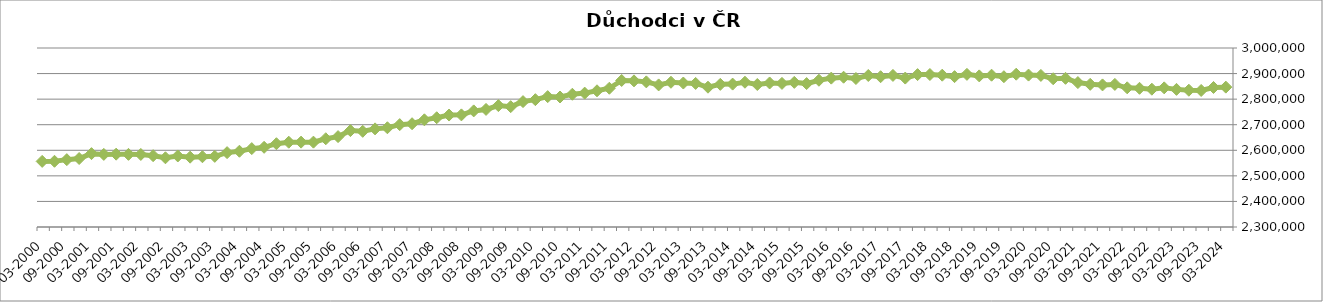
| Category | Důchodci celkem |
|---|---|
| 03-2024 | 2846965 |
| 12-2023 | 2845583 |
| 09-2023 | 2833931 |
| 06-2023 | 2834958 |
| 03-2023 | 2838175 |
| 12-2022 | 2844180 |
| 09-2022 | 2838955 |
| 06-2022 | 2842456 |
| 03-2022 | 2844309 |
| 12-2021 | 2857644 |
| 09-2021 | 2855669 |
| 06-2021 | 2857971 |
| 03-2021 | 2864719 |
| 12-2020 | 2881424 |
| 09-2020 | 2879686 |
| 06-2020 | 2892823 |
| 03-2020 | 2894058 |
| 12-2019 | 2897527 |
| 09-2019 | 2887695 |
| 06-2019 | 2893634 |
| 03-2019 | 2890927 |
| 12-2018 | 2896973 |
| 09-2018 | 2888033 |
| 06-2018 | 2893665 |
| 03-2018 | 2896292 |
| 12-2017 | 2895963 |
| 09-2017 | 2882415 |
| 06-2017 | 2892765 |
| 03-2017 | 2887731 |
| 12-2016 | 2892469 |
| 09-2016 | 2880677 |
| 06-2016 | 2885753 |
| 03-2016 | 2882164 |
| 12-2015 | 2873953 |
| 09-2015 | 2860813 |
| 06-2015 | 2865566 |
| 03-2015 | 2861611 |
| 12-2014 | 2863210 |
| 09-2014 | 2857229 |
| 06-2014 | 2866146 |
| 03-2014 | 2858820 |
| 12-2013 | 2857856 |
| 09-2013 | 2846736 |
| 06-2013 | 2861513 |
| 03-2013 | 2863034 |
| 12-2012 | 2866056 |
| 09-2012 | 2855623 |
| 06-2012 | 2867553 |
| 03-2012 | 2871453 |
| 12-2011 | 2873004 |
| 09-2011 | 2842624 |
| 06-2011 | 2832699 |
| 03-2011 | 2823583 |
| 12-2010 | 2819093 |
| 09-2010 | 2808379 |
| 06-2010 | 2809816 |
| 03-2010 | 2797939 |
| 12-2009 | 2790391 |
| 09-2009 | 2770585 |
| 06-2009 | 2774751 |
| 03-2009 | 2759803 |
| 12-2008 | 2754011 |
| 09-2008 | 2738474 |
| 06-2008 | 2737848 |
| 03-2008 | 2727240 |
| 12-2007 | 2719161 |
| 09-2007 | 2703847 |
| 06-2007 | 2700296 |
| 03-2007 | 2688078 |
| 12-2006 | 2683784 |
| 09-2006 | 2674191 |
| 06-2006 | 2676952 |
| 03-2006 | 2653503 |
| 12-2005 | 2645100 |
| 09-2005 | 2631838 |
| 06-2005 | 2631911 |
| 03-2005 | 2631601 |
| 12-2004 | 2625685 |
| 09-2004 | 2611669 |
| 06-2004 | 2606596 |
| 03-2004 | 2596243 |
| 12-2003 | 2590844 |
| 09-2003 | 2576302 |
| 06-2003 | 2574725 |
| 03-2003 | 2573082 |
| 12-2002 | 2577798 |
| 09-2002 | 2570679 |
| 06-2002 | 2578944 |
| 03-2002 | 2583717 |
| 12-2001 | 2584018 |
| 09-2001 | 2584828 |
| 06-2001 | 2583931 |
| 03-2001 | 2586893 |
| 12-2000 | 2567865 |
| 09-2000 | 2563400 |
| 06-2000 | 2557012 |
| 03-2000 | 2556586 |